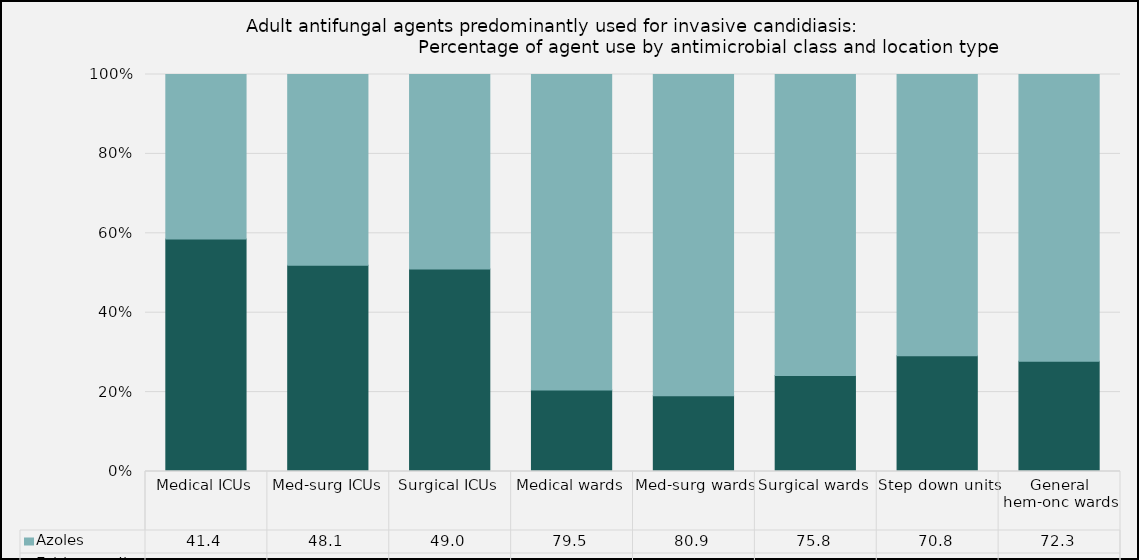
| Category | Echinocandins | Azoles |
|---|---|---|
| Medical ICUs | 58.57 | 41.43 |
| Med-surg ICUs | 51.95 | 48.05 |
| Surgical ICUs | 50.98 | 49.02 |
| Medical wards | 20.52 | 79.48 |
| Med-surg wards | 19.11 | 80.89 |
| Surgical wards | 24.18 | 75.82 |
| Step down units | 29.17 | 70.83 |
| General hem-onc wards | 27.74 | 72.26 |